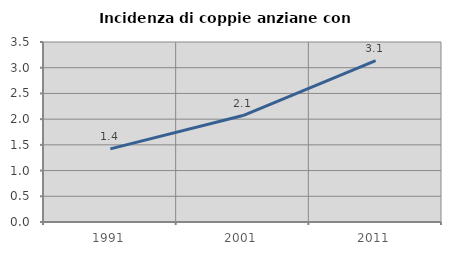
| Category | Incidenza di coppie anziane con figli |
|---|---|
| 1991.0 | 1.421 |
| 2001.0 | 2.069 |
| 2011.0 | 3.136 |